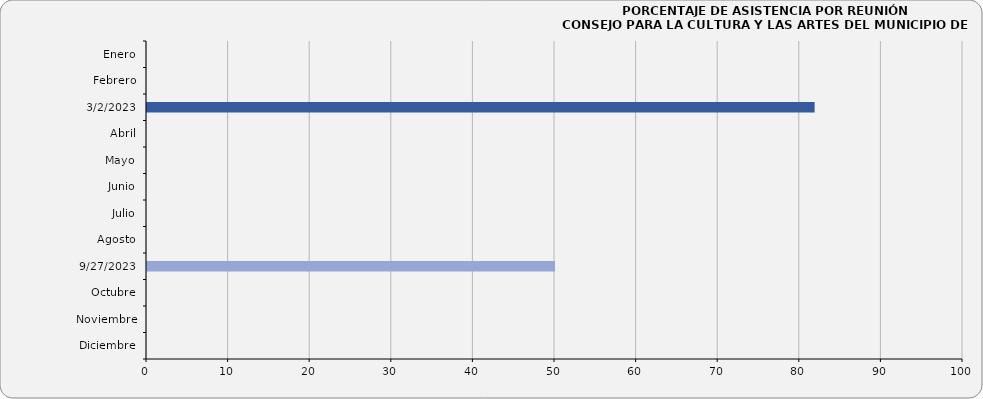
| Category | 18/02/2022 Febrero 11/03/2022 Abril Mayo 15/06/2022 Julio 15/08/2022 Septiembre Octubre Noviembre Diciembre |
|---|---|
| Enero | 0 |
| Febrero | 0 |
| 02/03/2023 | 81.818 |
| Abril | 0 |
| Mayo | 0 |
| Junio | 0 |
| Julio | 0 |
| Agosto | 0 |
| 27/09/2023 | 50 |
| Octubre | 0 |
| Noviembre | 0 |
| Diciembre | 0 |